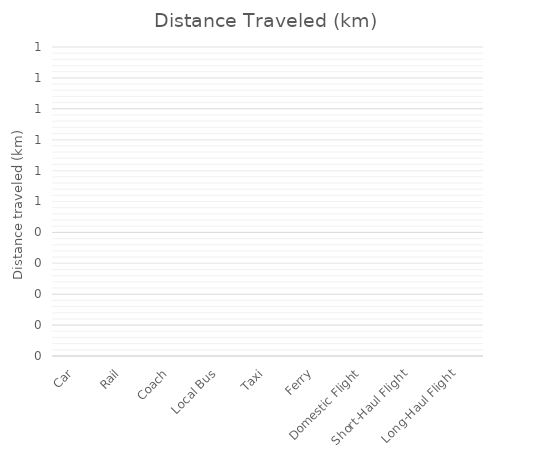
| Category | Distance Traveled (km) |
|---|---|
| Car | 0 |
| Rail | 0 |
| Coach | 0 |
| Local Bus | 0 |
| Taxi | 0 |
| Ferry | 0 |
| Domestic Flight | 0 |
| Short-Haul Flight | 0 |
| Long-Haul Flight | 0 |